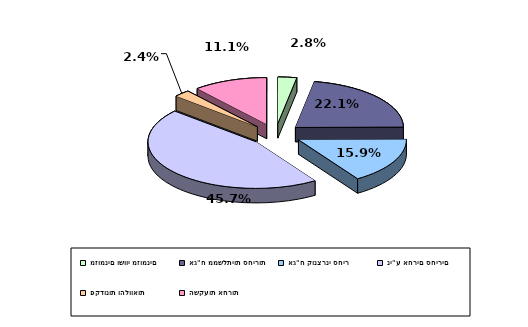
| Category | Series 0 |
|---|---|
| מזומנים ושווי מזומנים | 0.028 |
| אג"ח ממשלתיות סחירות | 0.221 |
| אג"ח קונצרני סחיר | 0.159 |
| ני"ע אחרים סחירים | 0.457 |
| פקדונות והלוואות | 0.024 |
| השקעות אחרות | 0.111 |